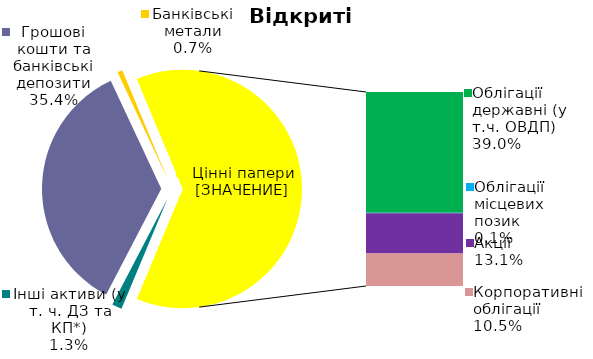
| Category | Series 0 |
|---|---|
| Інші активи (у т. ч. ДЗ та КП*) | 0.013 |
| Грошові кошти та банківські депозити | 0.354 |
| Банківські метали | 0.007 |
| Облігації державні (у т.ч. ОВДП) | 0.39 |
| Облігації місцевих позик | 0.001 |
| Акцiї | 0.131 |
| Корпоративні облігації | 0.105 |